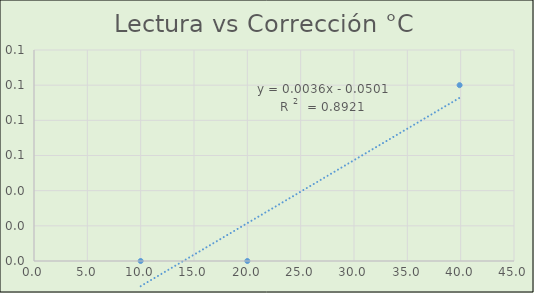
| Category | Series 0 |
|---|---|
| 10.0 | 0 |
| 20.0 | 0 |
| 39.9 | 0.1 |